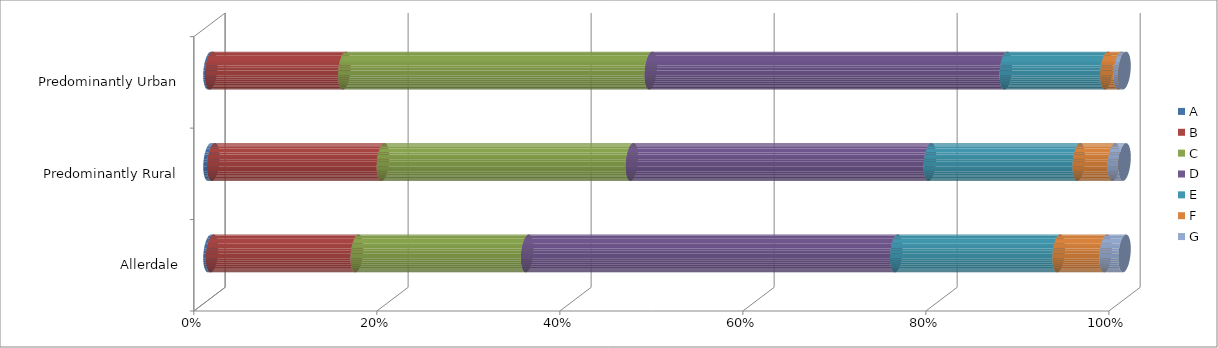
| Category | A | B | C | D | E | F | G |
|---|---|---|---|---|---|---|---|
| Allerdale | 0.003 | 0.158 | 0.186 | 0.403 | 0.177 | 0.051 | 0.021 |
| Predominantly Rural | 0.004 | 0.185 | 0.272 | 0.326 | 0.163 | 0.038 | 0.012 |
| Predominantly Urban | 0.002 | 0.146 | 0.335 | 0.388 | 0.11 | 0.015 | 0.005 |